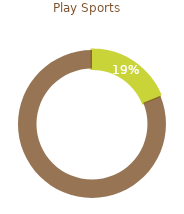
| Category | Play sports |
|---|---|
| 0 | 0.188 |
| 1 | 0.812 |